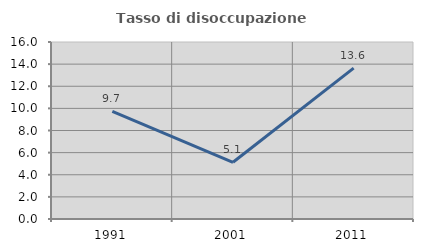
| Category | Tasso di disoccupazione giovanile  |
|---|---|
| 1991.0 | 9.722 |
| 2001.0 | 5.128 |
| 2011.0 | 13.636 |